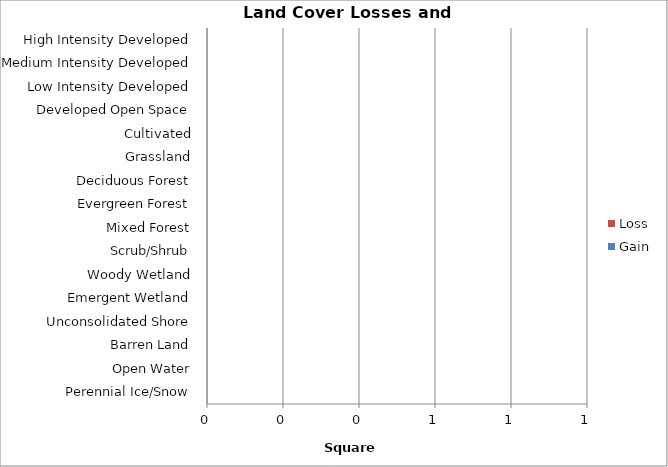
| Category | Loss | Gain |
|---|---|---|
| High Intensity Developed | 0 | 0 |
| Medium Intensity Developed | 0 | 0 |
| Low Intensity Developed | 0 | 0 |
| Developed Open Space | 0 | 0 |
| Cultivated | 0 | 0 |
| Grassland | 0 | 0 |
| Deciduous Forest | 0 | 0 |
| Evergreen Forest | 0 | 0 |
| Mixed Forest | 0 | 0 |
| Scrub/Shrub | 0 | 0 |
| Woody Wetland | 0 | 0 |
| Emergent Wetland | 0 | 0 |
| Unconsolidated Shore | 0 | 0 |
| Barren Land | 0 | 0 |
| Open Water | 0 | 0 |
| Perennial Ice/Snow | 0 | 0 |